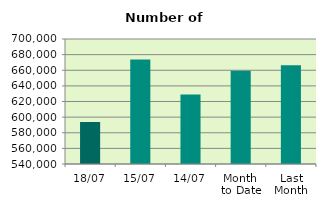
| Category | Series 0 |
|---|---|
| 18/07 | 593790 |
| 15/07 | 673888 |
| 14/07 | 629072 |
| Month 
to Date | 659402.333 |
| Last
Month | 666251.273 |